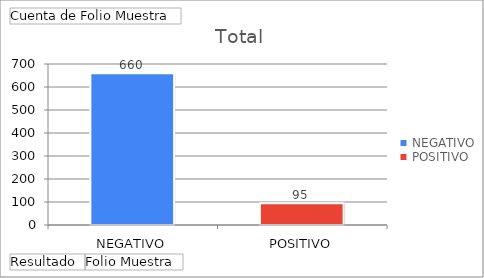
| Category | Total |
|---|---|
| NEGATIVO | 660 |
| POSITIVO | 95 |